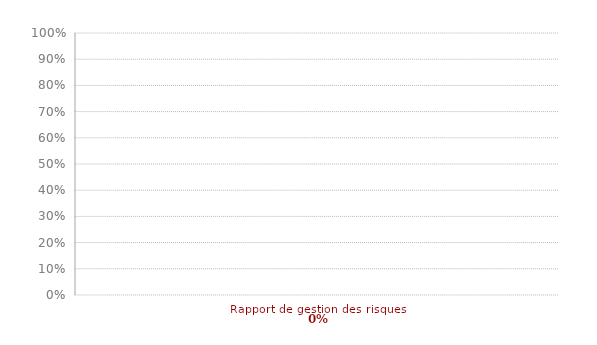
| Category | Art. 8 |
|---|---|
| Rapport de gestion des risques  | 0 |